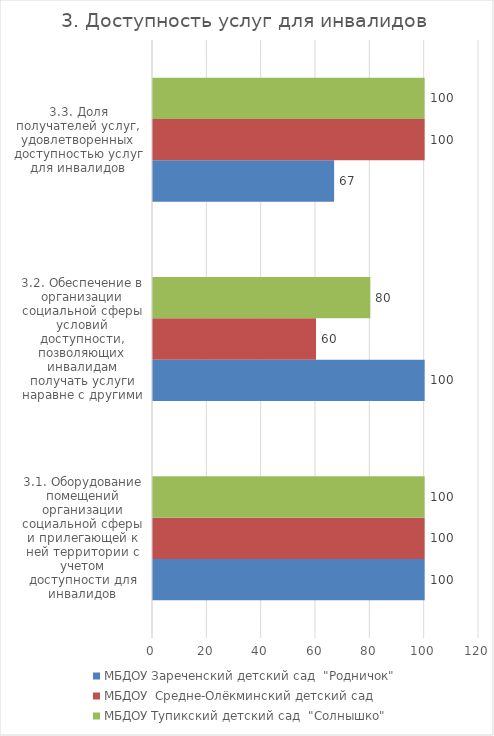
| Category | МБДОУ Зареченский детский сад  "Родничок" | МБДОУ  Средне-Олёкминский детский сад  | МБДОУ Тупикский детский сад  "Солнышко" |
|---|---|---|---|
| 3.1. Оборудование помещений организации социальной сферы и прилегающей к ней территории с учетом доступности для инвалидов | 100 | 100 | 100 |
| 3.2. Обеспечение в организации социальной сферы условий доступности, позволяющих инвалидам получать услуги наравне с другими | 100 | 60 | 80 |
| 3.3. Доля получателей услуг, удовлетворенных доступностью услуг для инвалидов | 66.667 | 100 | 100 |